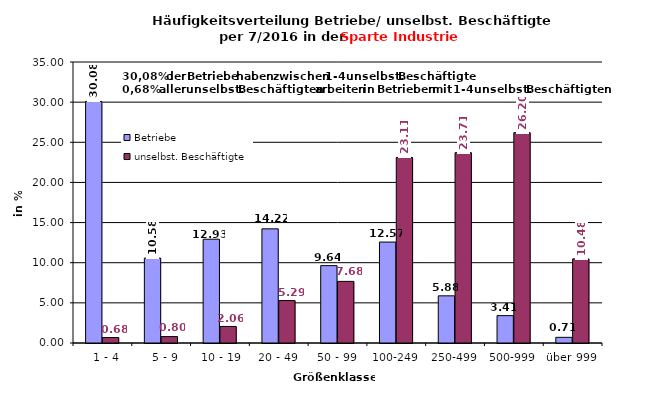
| Category | Betriebe | unselbst. Beschäftigte |
|---|---|---|
|   1 - 4 | 30.082 | 0.683 |
|   5 - 9 | 10.576 | 0.799 |
|  10 - 19 | 12.926 | 2.06 |
| 20 - 49 | 14.219 | 5.286 |
| 50 - 99 | 9.636 | 7.675 |
| 100-249 | 12.573 | 23.114 |
| 250-499 | 5.875 | 23.708 |
| 500-999 | 3.408 | 26.199 |
| über 999 | 0.705 | 10.478 |